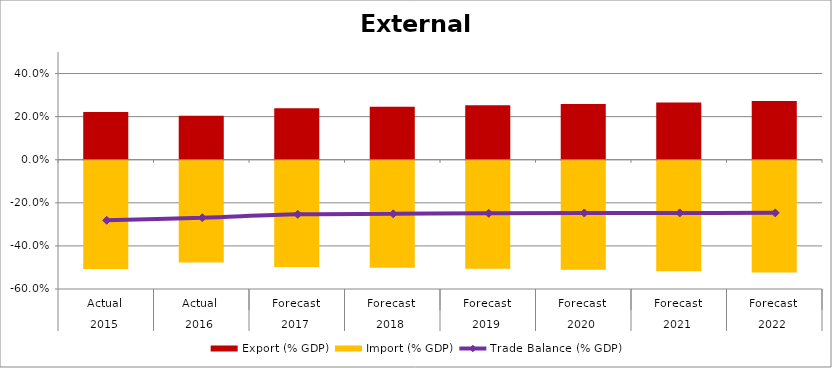
| Category | Export (% GDP) | Import (% GDP) |
|---|---|---|
| 0 | 0.221 | -0.503 |
| 1 | 0.204 | -0.473 |
| 2 | 0.239 | -0.493 |
| 3 | 0.246 | -0.497 |
| 4 | 0.253 | -0.501 |
| 5 | 0.259 | -0.506 |
| 6 | 0.266 | -0.513 |
| 7 | 0.273 | -0.519 |